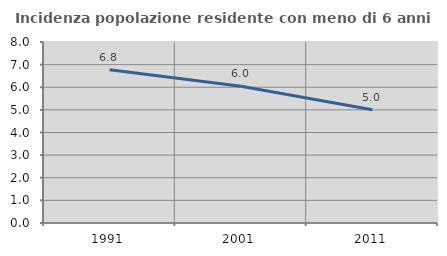
| Category | Incidenza popolazione residente con meno di 6 anni |
|---|---|
| 1991.0 | 6.773 |
| 2001.0 | 6.043 |
| 2011.0 | 5.007 |